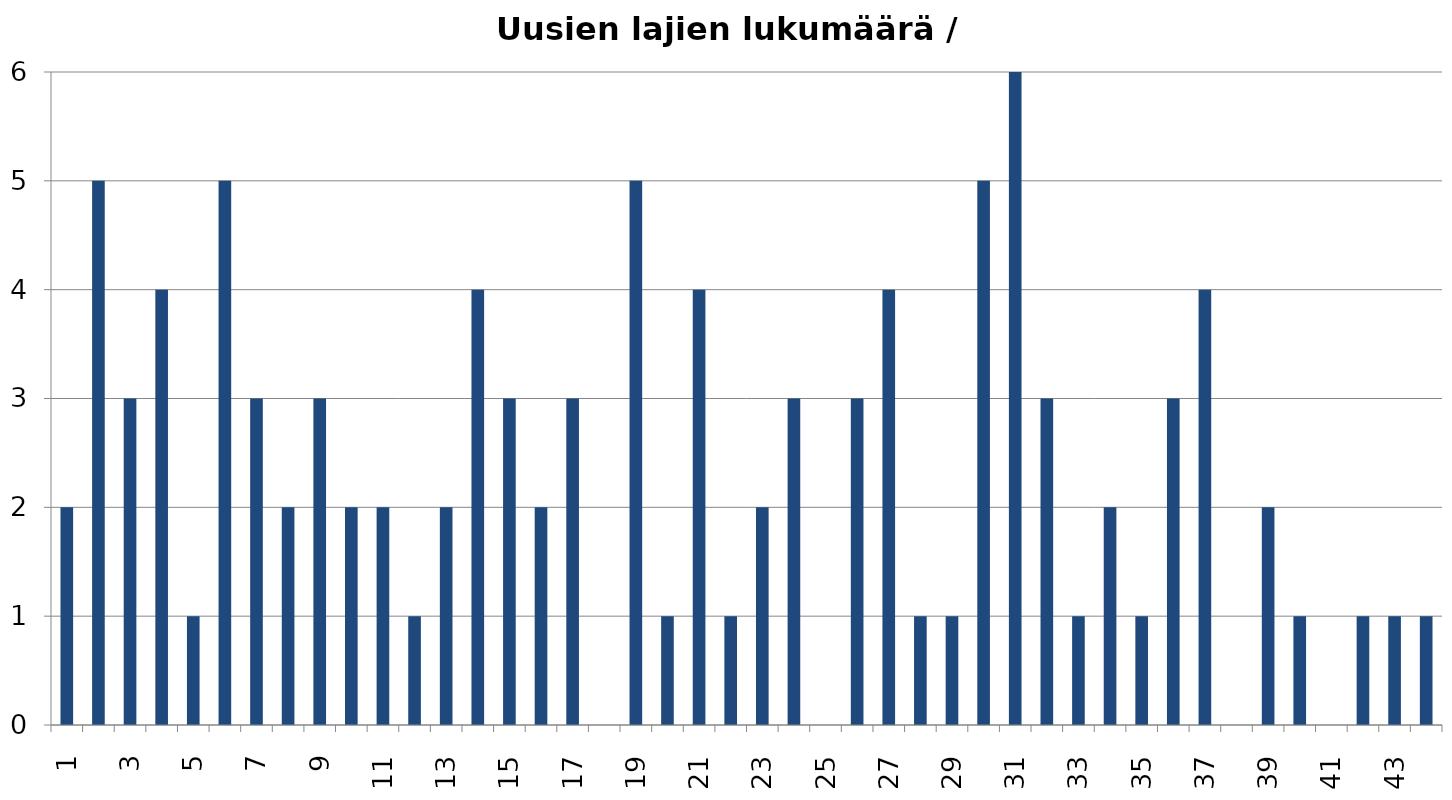
| Category | Series 0 |
|---|---|
| 0 | 2 |
| 1 | 5 |
| 2 | 3 |
| 3 | 4 |
| 4 | 1 |
| 5 | 5 |
| 6 | 3 |
| 7 | 2 |
| 8 | 3 |
| 9 | 2 |
| 10 | 2 |
| 11 | 1 |
| 12 | 2 |
| 13 | 4 |
| 14 | 3 |
| 15 | 2 |
| 16 | 3 |
| 17 | 0 |
| 18 | 5 |
| 19 | 1 |
| 20 | 4 |
| 21 | 1 |
| 22 | 2 |
| 23 | 3 |
| 24 | 0 |
| 25 | 3 |
| 26 | 4 |
| 27 | 1 |
| 28 | 1 |
| 29 | 5 |
| 30 | 6 |
| 31 | 3 |
| 32 | 1 |
| 33 | 2 |
| 34 | 1 |
| 35 | 3 |
| 36 | 4 |
| 37 | 0 |
| 38 | 2 |
| 39 | 1 |
| 40 | 0 |
| 41 | 1 |
| 42 | 1 |
| 43 | 1 |